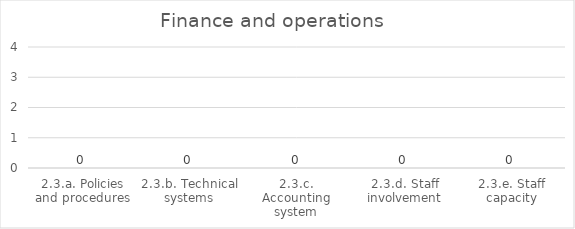
| Category | Finance and operations |
|---|---|
| 2.3.a. Policies and procedures | 0 |
| 2.3.b. Technical systems | 0 |
| 2.3.c. Accounting system | 0 |
| 2.3.d. Staff involvement | 0 |
| 2.3.e. Staff capacity | 0 |